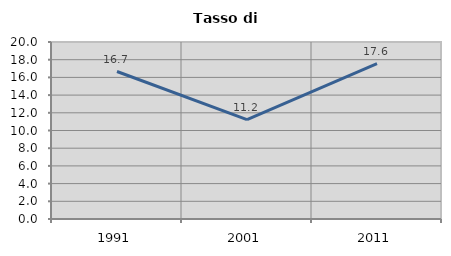
| Category | Tasso di disoccupazione   |
|---|---|
| 1991.0 | 16.667 |
| 2001.0 | 11.23 |
| 2011.0 | 17.553 |